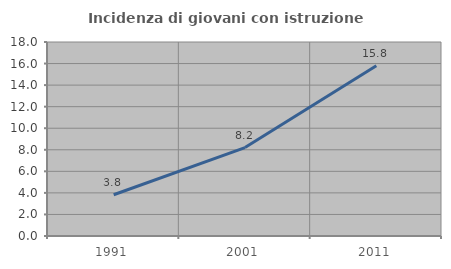
| Category | Incidenza di giovani con istruzione universitaria |
|---|---|
| 1991.0 | 3.825 |
| 2001.0 | 8.203 |
| 2011.0 | 15.789 |